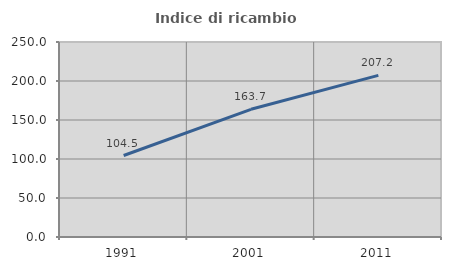
| Category | Indice di ricambio occupazionale  |
|---|---|
| 1991.0 | 104.485 |
| 2001.0 | 163.69 |
| 2011.0 | 207.159 |